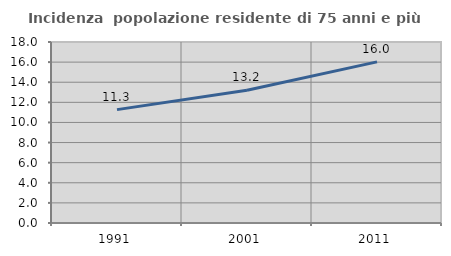
| Category | Incidenza  popolazione residente di 75 anni e più |
|---|---|
| 1991.0 | 11.275 |
| 2001.0 | 13.198 |
| 2011.0 | 16.027 |